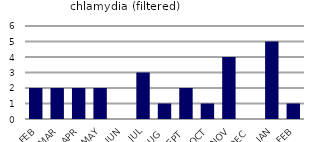
| Category | chlamydia (filtered) |
|---|---|
| FEB | 2 |
| MAR | 2 |
| APR | 2 |
| MAY | 2 |
| JUN | 0 |
| JUL | 3 |
| AUG | 1 |
| SEPT | 2 |
| OCT | 1 |
| NOV | 4 |
| DEC | 0 |
| JAN | 5 |
| FEB | 1 |